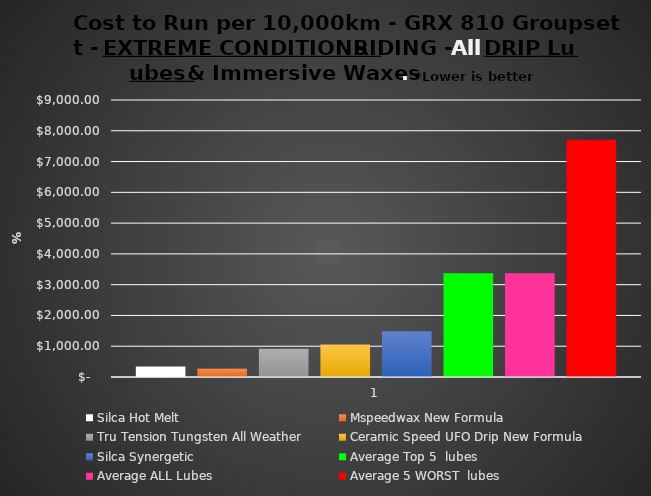
| Category | Silca Hot Melt | Mspeedwax New Formula | Tru Tension Tungsten All Weather | Ceramic Speed UFO Drip New Formula | Silca Synergetic | Average Top 5  lubes | Average ALL Lubes | Average 5 WORST  lubes |
|---|---|---|---|---|---|---|---|---|
| 0 | 338.6 | 275.85 | 915 | 1058.65 | 1482.75 | 3375 | 3375 | 7711 |